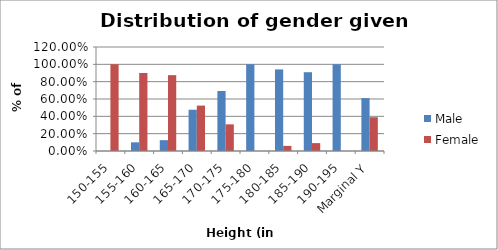
| Category | Male | Female |
|---|---|---|
| 150-155 | 0 | 1 |
| 155-160 | 0.1 | 0.9 |
| 160-165 | 0.125 | 0.875 |
| 165-170 | 0.476 | 0.524 |
| 170-175 | 0.692 | 0.308 |
| 175-180 | 1 | 0 |
| 180-185 | 0.941 | 0.059 |
| 185-190 | 0.909 | 0.091 |
| 190-195 | 1 | 0 |
| Marginal Y | 0.61 | 0.39 |